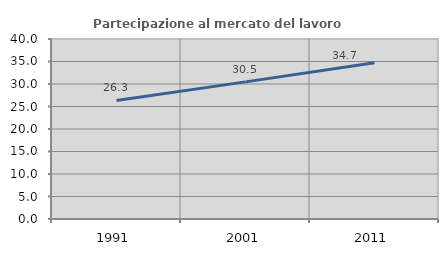
| Category | Partecipazione al mercato del lavoro  femminile |
|---|---|
| 1991.0 | 26.348 |
| 2001.0 | 30.476 |
| 2011.0 | 34.732 |